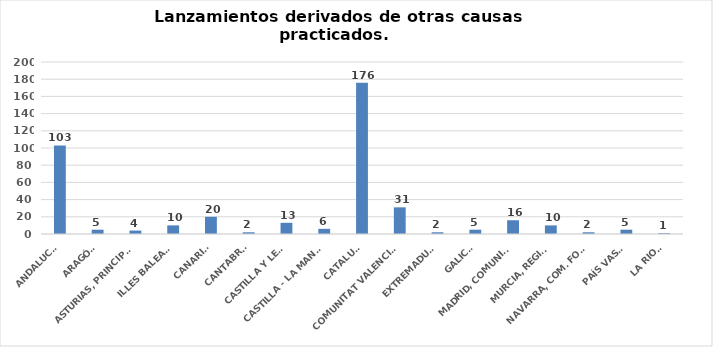
| Category | Series 0 |
|---|---|
| ANDALUCÍA | 103 |
| ARAGÓN | 5 |
| ASTURIAS, PRINCIPADO | 4 |
| ILLES BALEARS | 10 |
| CANARIAS | 20 |
| CANTABRIA | 2 |
| CASTILLA Y LEÓN | 13 |
| CASTILLA - LA MANCHA | 6 |
| CATALUÑA | 176 |
| COMUNITAT VALENCIANA | 31 |
| EXTREMADURA | 2 |
| GALICIA | 5 |
| MADRID, COMUNIDAD | 16 |
| MURCIA, REGIÓN | 10 |
| NAVARRA, COM. FORAL | 2 |
| PAÍS VASCO | 5 |
| LA RIOJA | 1 |